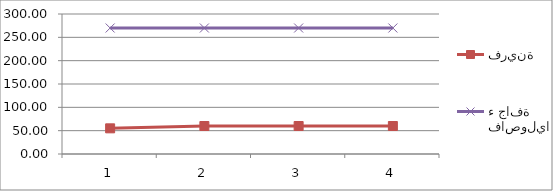
| Category | فرينة | فاصولياء جافة |
|---|---|---|
| 0 | 55 | 270 |
| 1 | 60 | 270 |
| 2 | 60 | 270 |
| 3 | 60 | 270 |